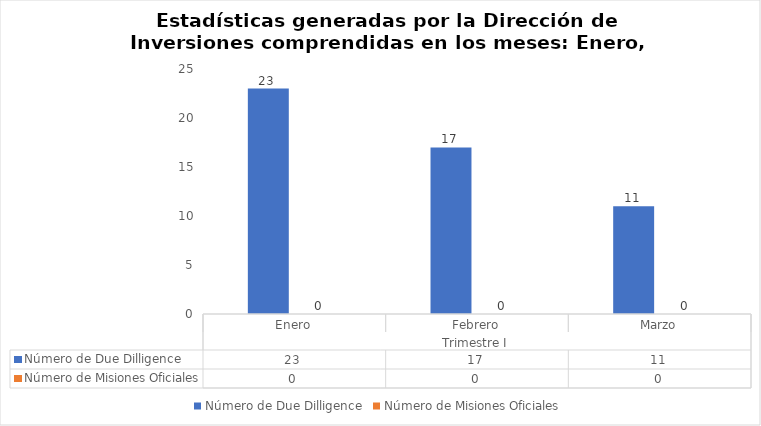
| Category | Número de Due Dilligence | Número de Misiones Oficiales |
|---|---|---|
| 0 | 23 | 0 |
| 1 | 17 | 0 |
| 2 | 11 | 0 |